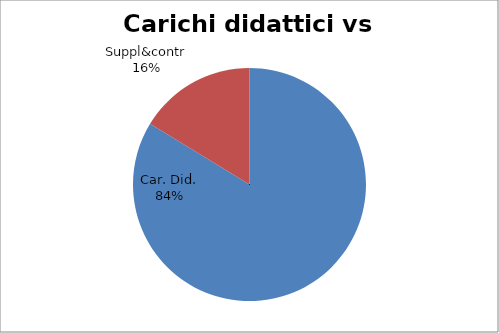
| Category | Series 0 |
|---|---|
| Car. Did. | 0.837 |
| Suppl&contr | 0.163 |